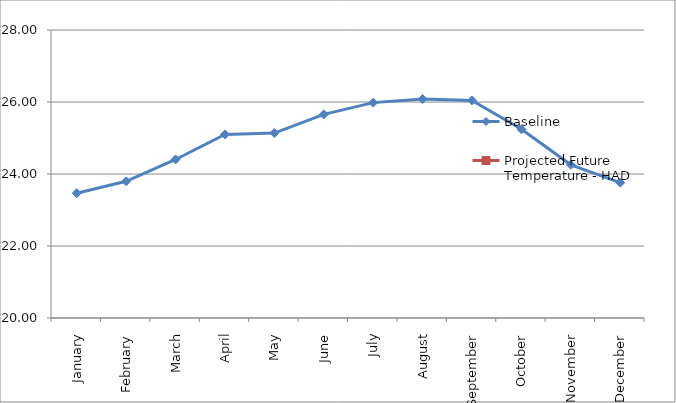
| Category | Baseline | Projected Future Temperature - HAD | Projected Future Temperature - ECHAM |
|---|---|---|---|
| January | 23.466 |  |  |
| February | 23.797 |  |  |
| March | 24.403 |  |  |
| April | 25.1 |  |  |
| May | 25.138 |  |  |
| June | 25.655 |  |  |
| July | 25.983 |  |  |
| August | 26.083 |  |  |
| September | 26.045 |  |  |
| October | 25.241 |  |  |
| November | 24.255 |  |  |
| December | 23.759 |  |  |